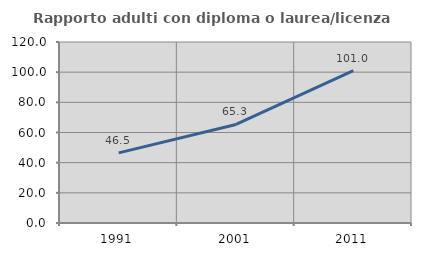
| Category | Rapporto adulti con diploma o laurea/licenza media  |
|---|---|
| 1991.0 | 46.471 |
| 2001.0 | 65.328 |
| 2011.0 | 100.997 |